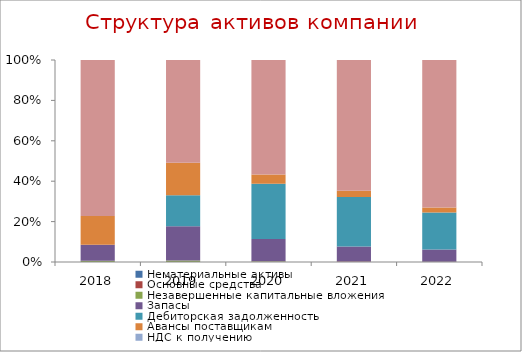
| Category | Нематериальные активы | Основные средства | Незавершенные капитальные вложения | Запасы | Дебиторская задолженность | Авансы поставщикам | НДС к получению | Денежные средства и их эквиваленты |
|---|---|---|---|---|---|---|---|---|
| 2018.0 | 0 | 0 | 0.007 | 0.079 | 0 | 0.142 | 0 | 0.772 |
| 2019.0 | 0 | 0 | 0.007 | 0.17 | 0.154 | 0.161 | 0 | 0.509 |
| 2020.0 | 0 | 0.001 | 0.003 | 0.111 | 0.273 | 0.047 | 0 | 0.566 |
| 2021.0 | 0 | 0.002 | 0 | 0.075 | 0.245 | 0.031 | 0 | 0.647 |
| 2022.0 | 0 | 0.001 | 0 | 0.061 | 0.183 | 0.025 | 0 | 0.73 |